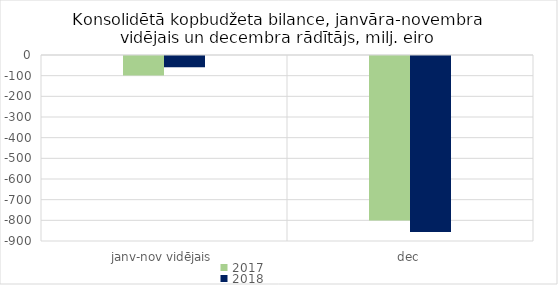
| Category | 2017 | 2018 |
|---|---|---|
| janv-nov vidējais | -93800.107 | -54489.572 |
| dec | -796518.828 | -851302.945 |